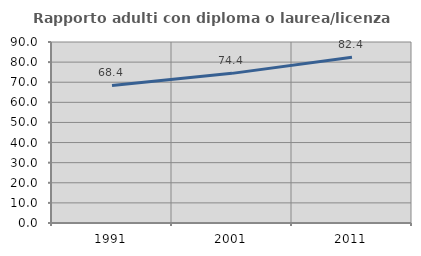
| Category | Rapporto adulti con diploma o laurea/licenza media  |
|---|---|
| 1991.0 | 68.396 |
| 2001.0 | 74.405 |
| 2011.0 | 82.396 |